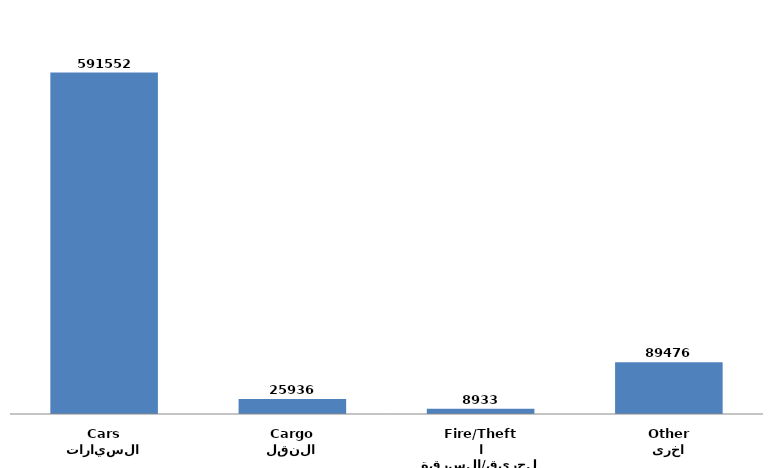
| Category | Series 0 |
|---|---|
| السيارات
Cars | 591552 |
| النقل
Cargo | 25936 |
| الحريق/السرقة
Fire/Theft | 8933 |
| اخرى
Other | 89476 |